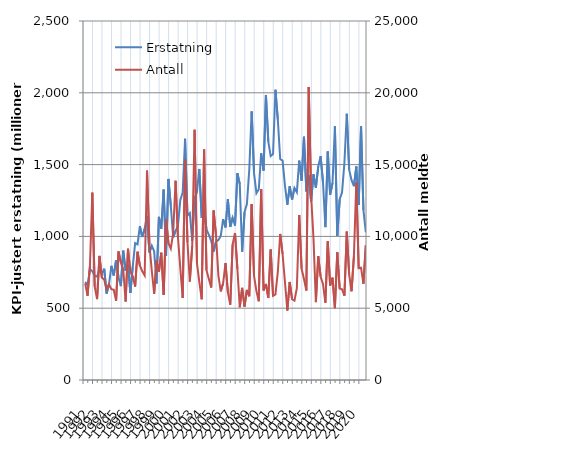
| Category | Erstatning |
|---|---|
| 1991.0 | 682.861 |
| nan | 660.593 |
| nan | 770.781 |
| nan | 757.68 |
| 1992.0 | 724.967 |
| nan | 720.337 |
| nan | 769.124 |
| nan | 738.283 |
| 1993.0 | 775.228 |
| nan | 602.058 |
| nan | 664.256 |
| nan | 794.965 |
| 1994.0 | 727.895 |
| nan | 835.014 |
| nan | 715.669 |
| nan | 653.422 |
| 1995.0 | 900.586 |
| nan | 761.203 |
| nan | 803.181 |
| nan | 605.711 |
| 1996.0 | 789.173 |
| nan | 953.39 |
| nan | 943.881 |
| nan | 1071.001 |
| 1997.0 | 996.152 |
| nan | 1053.434 |
| nan | 1142.066 |
| nan | 887.884 |
| 1998.0 | 935.373 |
| nan | 896.35 |
| nan | 671.783 |
| nan | 1136.193 |
| 1999.0 | 1052.729 |
| nan | 1325.657 |
| nan | 863.644 |
| nan | 1400.154 |
| 2000.0 | 1214.232 |
| nan | 993.707 |
| nan | 1038.895 |
| nan | 1072.169 |
| 2001.0 | 1253.265 |
| nan | 1304.559 |
| nan | 1679.765 |
| nan | 1144.776 |
| 2002.0 | 1162.727 |
| nan | 970.425 |
| nan | 1266.256 |
| nan | 1309.736 |
| 2003.0 | 1469.594 |
| nan | 1128.08 |
| nan | 1190.808 |
| nan | 1048.721 |
| 2004.0 | 1011.439 |
| nan | 967.557 |
| nan | 894.762 |
| nan | 963.959 |
| 2005.0 | 974.405 |
| nan | 1002.461 |
| nan | 1119.883 |
| nan | 1062.719 |
| 2006.0 | 1258.391 |
| nan | 1065.827 |
| nan | 1130.31 |
| nan | 1075.24 |
| 2007.0 | 1439.915 |
| nan | 1364.05 |
| nan | 893.677 |
| nan | 1169.116 |
| 2008.0 | 1224.519 |
| nan | 1465.019 |
| nan | 1870.593 |
| nan | 1441 |
| 2009.0 | 1301.099 |
| nan | 1328.36 |
| nan | 1578.846 |
| nan | 1458.773 |
| 2010.0 | 1984.188 |
| nan | 1660.479 |
| nan | 1559.014 |
| nan | 1574.052 |
| 2011.0 | 2021.055 |
| nan | 1813.246 |
| nan | 1538.78 |
| nan | 1527.545 |
| 2012.0 | 1353.017 |
| nan | 1220.672 |
| nan | 1348.959 |
| nan | 1256.877 |
| 2013.0 | 1337.311 |
| nan | 1307.667 |
| nan | 1527.592 |
| nan | 1388.401 |
| 2014.0 | 1693.847 |
| nan | 1313.108 |
| nan | 1424.554 |
| nan | 1243.361 |
| 2015.0 | 1432.487 |
| nan | 1339.063 |
| nan | 1487.095 |
| nan | 1558.19 |
| 2016.0 | 1375.58 |
| nan | 1064.405 |
| nan | 1591.137 |
| nan | 1290.489 |
| 2017.0 | 1371.785 |
| nan | 1767.479 |
| nan | 1003.271 |
| nan | 1257.841 |
| 2018.0 | 1305.9 |
| nan | 1512.06 |
| nan | 1853.654 |
| nan | 1464.441 |
| 2019.0 | 1391.758 |
| nan | 1349.421 |
| nan | 1486.971 |
| nan | 1218.36 |
| 2020.0 | 1766.411 |
| nan | 1183.175 |
| nan | 1028.942 |